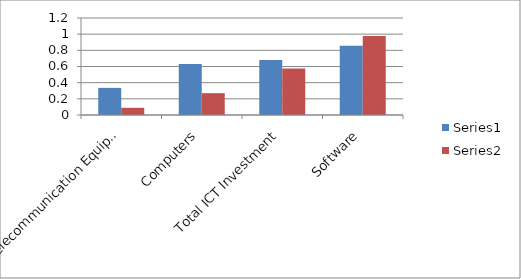
| Category | Series 0 | Series 1 |
|---|---|---|
| Telecommunication Equipment | 0.335 | 0.089 |
| Computers | 0.63 | 0.27 |
| Total ICT Investment | 0.681 | 0.576 |
| Software | 0.857 | 0.976 |